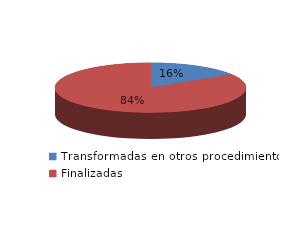
| Category | Series 0 |
|---|---|
| Transformadas en otros procedimientos | 3028 |
| Finalizadas | 16026 |